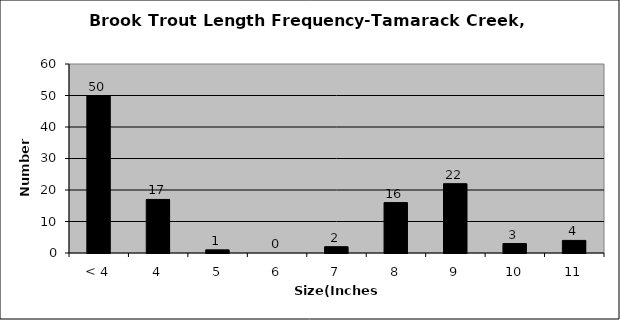
| Category | Series 0 |
|---|---|
| < 4 | 50 |
| 4 | 17 |
| 5 | 1 |
| 6 | 0 |
| 7 | 2 |
| 8 | 16 |
| 9 | 22 |
| 10 | 3 |
| 11 | 4 |